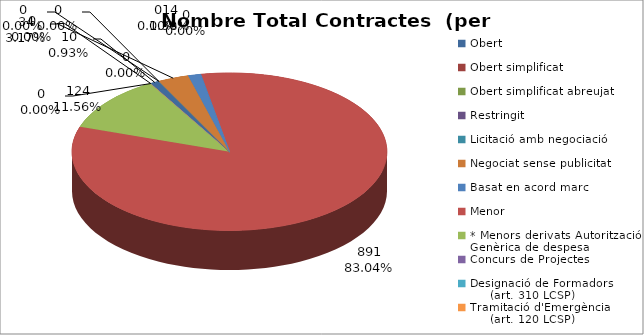
| Category | Nombre Total Contractes |
|---|---|
| Obert | 10 |
| Obert simplificat | 0 |
| Obert simplificat abreujat | 0 |
| Restringit | 0 |
| Licitació amb negociació | 0 |
| Negociat sense publicitat | 34 |
| Basat en acord marc | 14 |
| Menor | 891 |
| * Menors derivats Autorització Genèrica de despesa | 124 |
| Concurs de Projectes | 0 |
| Designació de Formadors
     (art. 310 LCSP) | 0 |
| Tramitació d'Emergència
     (art. 120 LCSP) | 0 |